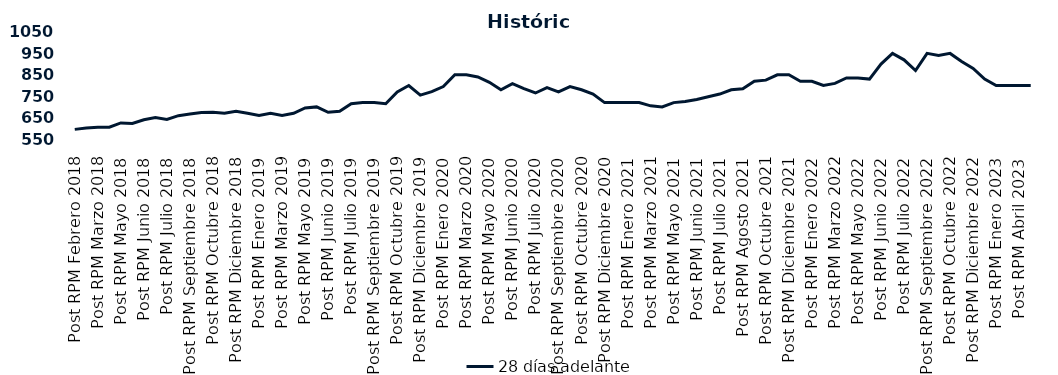
| Category | 28 días adelante |
|---|---|
| Post RPM Febrero 2018 | 595 |
| Pre RPM Marzo 2018 | 601 |
| Post RPM Marzo 2018 | 605 |
| Pre RPM Mayo 2018 | 605 |
| Post RPM Mayo 2018 | 625 |
| Pre RPM Junio 2018 | 623 |
| Post RPM Junio 2018 | 640 |
| Pre RPM Julio 2018 | 650 |
| Post RPM Julio 2018 | 641 |
| Pre RPM Septiembre 2018 | 659 |
| Post RPM Septiembre 2018 | 666.75 |
| Pre RPM Octubre 2018 | 674 |
| Post RPM Octubre 2018 | 675 |
| Pre RPM Diciembre 2018 | 670 |
| Post RPM Diciembre 2018 | 680 |
| Pre RPM Enero 2019 | 670 |
| Post RPM Enero 2019 | 660 |
| Pre RPM Marzo 2019 | 670 |
| Post RPM Marzo 2019 | 660 |
| Pre RPM Mayo 2019 | 670 |
| Post RPM Mayo 2019 | 695 |
| Pre RPM Junio 2019 | 700 |
| Post RPM Junio 2019 | 675 |
| Pre RPM Julio 2019 | 680 |
| Post RPM Julio 2019 | 715 |
| Pre RPM Septiembre 2019 | 720 |
| Post RPM Septiembre 2019 | 720 |
| Pre RPM Octubre 2019 | 715 |
| Post RPM Octubre 2019 | 770 |
| Pre RPM Diciembre 2019 | 800 |
| Post RPM Diciembre 2019 | 755 |
| Pre RPM Enero 2020 | 771 |
| Post RPM Enero 2020 | 795 |
| Pre RPM Marzo 2020 | 850 |
| Post RPM Marzo 2020 | 850 |
| Pre RPM Mayo 2020 | 840 |
| Post RPM Mayo 2020 | 815 |
| Pre RPM Junio 2020 | 780 |
| Post RPM Junio 2020 | 809 |
| Pre RPM Julio 2020 | 785.72 |
| Post RPM Julio 2020 | 765 |
| Pre RPM Septiembre 2020 | 790 |
| Post RPM Septiembre 2020 | 770 |
| Pre RPM Octubre 2020 | 795 |
| Post RPM Octubre 2020 | 780 |
| Pre RPM Diciembre 2020 | 760 |
| Post RPM Diciembre 2020 | 720 |
| Pre RPM Enero 2021 | 720 |
| Post RPM Enero 2021 | 720 |
| Pre RPM Marzo 2021 | 720 |
| Post RPM Marzo 2021 | 705 |
| Pre RPM Mayo 2021 | 700 |
| Post RPM Mayo 2021 | 720 |
| Pre RPM Junio 2021 | 725 |
| Post RPM Junio 2021 | 735 |
| Pre RPM Julio 2021 | 747.5 |
| Post RPM Julio 2021 | 760 |
| Pre RPM Agosto 2021 | 780 |
| Post RPM Agosto 2021 | 785 |
| Pre RPM Octubre 2021 | 820 |
| Post RPM Octubre 2021 | 825 |
| Pre RPM Diciembre 2021 | 850 |
| Post RPM Diciembre 2021 | 850 |
| Pre RPM Enero 2022 | 820 |
| Post RPM Enero 2022 | 820 |
| Pre RPM Marzo 2022 | 800 |
| Post RPM Marzo 2022 | 810 |
| Pre RPM Mayo 2022 | 835 |
| Post RPM Mayo 2022 | 835 |
| Pre RPM Junio 2022 | 830 |
| Post RPM Junio 2022 | 900 |
| Pre RPM Julio 2022 | 950 |
| Post RPM Julio 2022 | 920 |
| Pre RPM Septiembre 2022 | 870 |
| Post RPM Septiembre 2022 | 950 |
| Pre RPM Octubre 2022 | 940 |
| Post RPM Octubre 2022 | 950 |
| Pre RPM Diciembre 2022 | 912.5 |
| Post RPM Diciembre 2022 | 880 |
| Pre RPM Enero 2023 | 830 |
| Post RPM Enero 2023 | 800 |
| Pre RPM Abril 2023 | 800 |
| Post RPM Abril 2023 | 800 |
| Pre RPM Mayo 2023 | 800 |